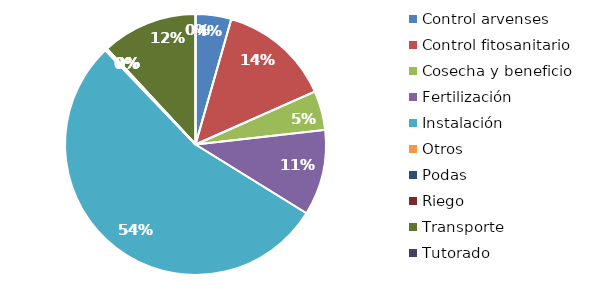
| Category | Valor |
|---|---|
| Control arvenses | 487842 |
| Control fitosanitario | 1534889 |
| Cosecha y beneficio | 535879.3 |
| Fertilización | 1170199 |
| Instalación | 5954214.441 |
| Otros | 29771 |
| Podas | 0 |
| Riego | 0 |
| Transporte | 1309928 |
| Tutorado | 0 |